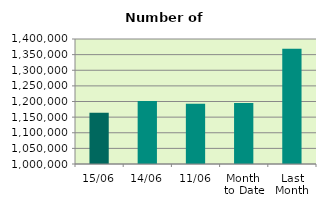
| Category | Series 0 |
|---|---|
| 15/06 | 1163884 |
| 14/06 | 1201344 |
| 11/06 | 1192836 |
| Month 
to Date | 1195517.636 |
| Last
Month | 1368600.286 |